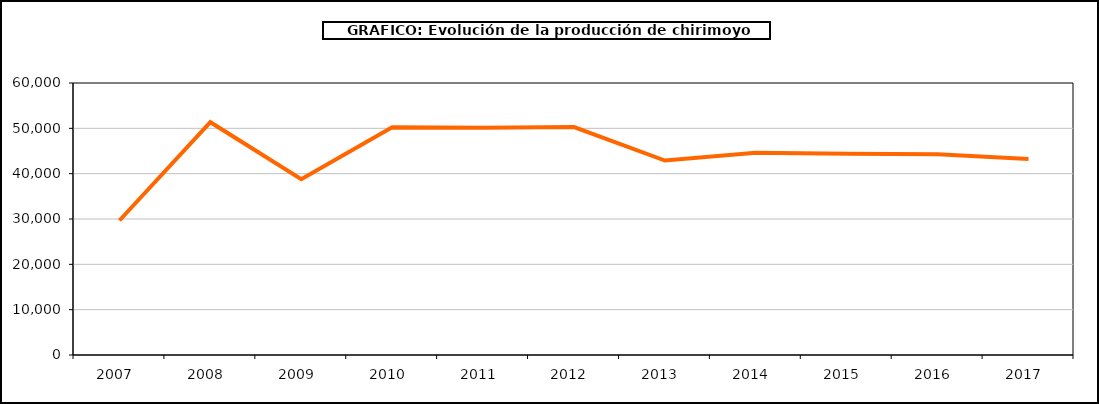
| Category | producción chirimoyo |
|---|---|
| 2007.0 | 29671 |
| 2008.0 | 51356 |
| 2009.0 | 38775 |
| 2010.0 | 50241 |
| 2011.0 | 50150 |
| 2012.0 | 50285 |
| 2013.0 | 42898 |
| 2014.0 | 44629 |
| 2015.0 | 44389 |
| 2016.0 | 44305 |
| 2017.0 | 43251 |